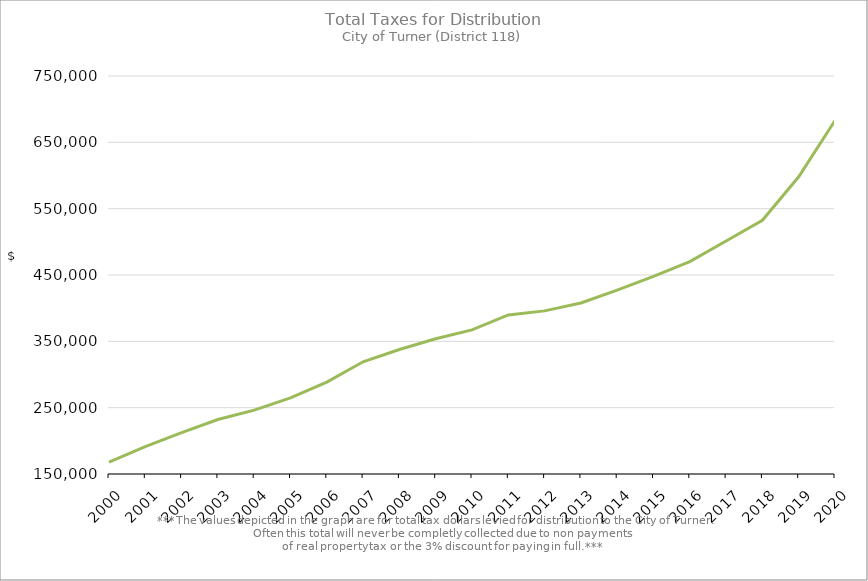
| Category | Series 0 |
|---|---|
| 2000.0 | 168041.8 |
| 2001.0 | 191398.86 |
| 2002.0 | 212333.7 |
| 2003.0 | 232073.68 |
| 2004.0 | 246360.97 |
| 2005.0 | 264765.11 |
| 2006.0 | 288487.11 |
| 2007.0 | 319164.82 |
| 2008.0 | 337680.22 |
| 2009.0 | 353826.04 |
| 2010.0 | 367325.41 |
| 2011.0 | 389733.02 |
| 2012.0 | 395911.03 |
| 2013.0 | 407868.09 |
| 2014.0 | 427278.95 |
| 2015.0 | 447813.66 |
| 2016.0 | 470180.44 |
| 2017.0 | 501209.81 |
| 2018.0 | 532589.56 |
| 2019.0 | 598138.32 |
| 2020.0 | 682863.47 |